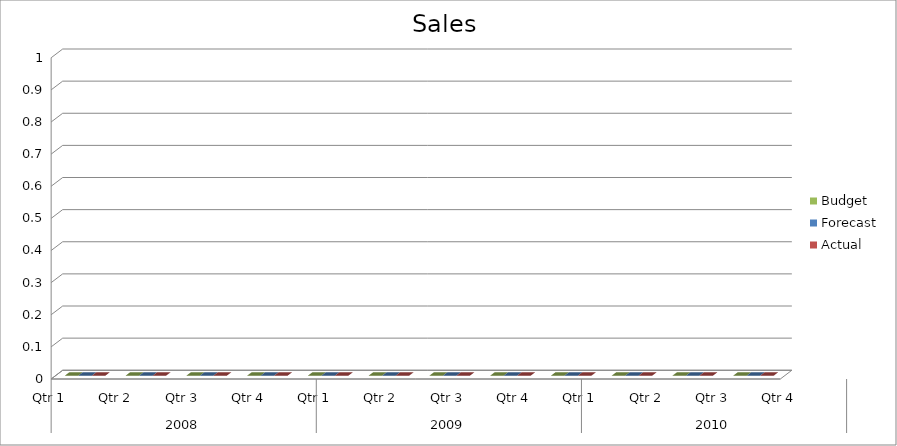
| Category | Budget | Forecast | Actual |
|---|---|---|---|
| 0 | 2680 | 1150 | 2670 |
| 1 | 2740 | 2940 | 2800 |
| 2 | 2120 | 2900 | 1560 |
| 3 | 880 | 2820 | 3300 |
| 4 | 2550 | 1150 | 1740 |
| 5 | 2430 | 1580 | 2370 |
| 6 | 2100 | 2090 | 2750 |
| 7 | 2330 | 3320 | 2070 |
| 8 | 2830 | 1400 | 1150 |
| 9 | 1370 | 2700 | 2430 |
| 10 | 2220 | 1130 | 3260 |
| 11 | 560 | 2470 | 1510 |